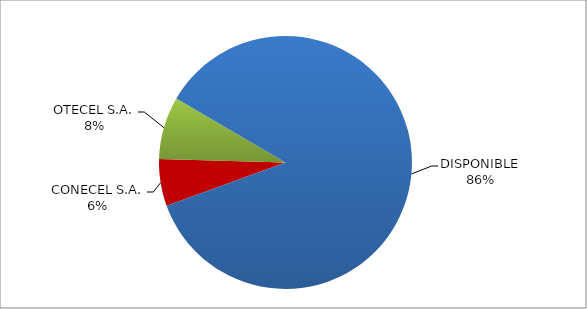
| Category | CÓDIGO DE RED 97 |
|---|---|
| CONECEL S.A. | 0.06 |
| OTECEL S.A. | 0.08 |
| DISPONIBLE | 0.86 |